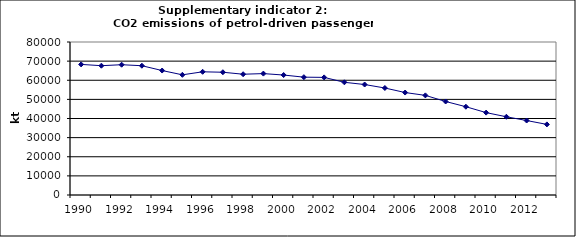
| Category | CO2 emissions of petrol-driven passenger cars, kt |
|---|---|
| 1990 | 68288.041 |
| 1991 | 67613.778 |
| 1992 | 68123.52 |
| 1993 | 67590.581 |
| 1994 | 65081.355 |
| 1995 | 62836.394 |
| 1996 | 64419.754 |
| 1997 | 64183.421 |
| 1998 | 63153.221 |
| 1999 | 63477.658 |
| 2000 | 62724.279 |
| 2001 | 61609.828 |
| 2002 | 61496.394 |
| 2003 | 58922.846 |
| 2004 | 57767.003 |
| 2005 | 55947.491 |
| 2006 | 53571.981 |
| 2007 | 52085.002 |
| 2008 | 48895.096 |
| 2009 | 46157.898 |
| 2010 | 43075.677 |
| 2011 | 40902.563 |
| 2012 | 38939.8 |
| 2013 | 36917.31 |